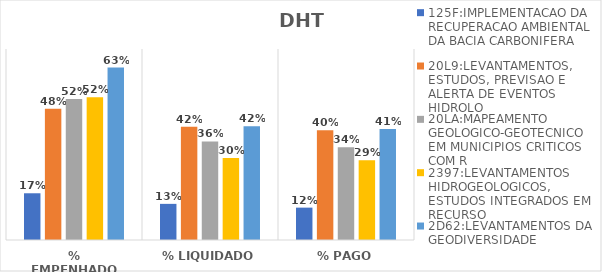
| Category | 125F:IMPLEMENTACAO DA RECUPERACAO AMBIENTAL DA BACIA CARBONIFERA | 20L9:LEVANTAMENTOS, ESTUDOS, PREVISAO E ALERTA DE EVENTOS HIDROLO | 20LA:MAPEAMENTO GEOLOGICO-GEOTECNICO EM MUNICIPIOS CRITICOS COM R | 2397:LEVANTAMENTOS HIDROGEOLOGICOS, ESTUDOS INTEGRADOS EM RECURSO | 2D62:LEVANTAMENTOS DA GEODIVERSIDADE |
|---|---|---|---|---|---|
| % EMPENHADO | 0.171 | 0.481 | 0.517 | 0.523 | 0.632 |
| % LIQUIDADO | 0.132 | 0.415 | 0.361 | 0.3 | 0.417 |
| % PAGO | 0.119 | 0.402 | 0.34 | 0.292 | 0.407 |